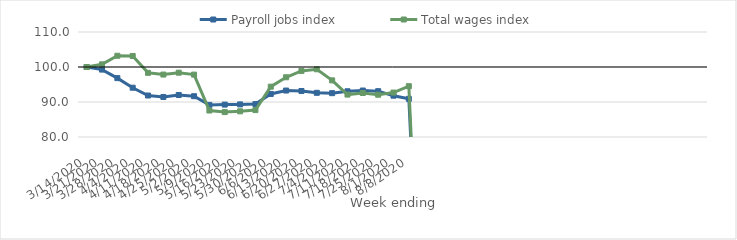
| Category | Payroll jobs index | Total wages index |
|---|---|---|
| 14/03/2020 | 100 | 100 |
| 21/03/2020 | 99.263 | 100.76 |
| 28/03/2020 | 96.819 | 103.206 |
| 04/04/2020 | 94.077 | 103.144 |
| 11/04/2020 | 91.854 | 98.338 |
| 18/04/2020 | 91.436 | 97.841 |
| 25/04/2020 | 92.001 | 98.379 |
| 02/05/2020 | 91.654 | 97.822 |
| 09/05/2020 | 89.164 | 87.568 |
| 16/05/2020 | 89.257 | 87.116 |
| 23/05/2020 | 89.315 | 87.338 |
| 30/05/2020 | 89.399 | 87.689 |
| 06/06/2020 | 92.298 | 94.38 |
| 13/06/2020 | 93.275 | 97.064 |
| 20/06/2020 | 93.146 | 98.89 |
| 27/06/2020 | 92.625 | 99.348 |
| 04/07/2020 | 92.524 | 96.181 |
| 11/07/2020 | 93.064 | 92.116 |
| 18/07/2020 | 93.28 | 92.567 |
| 25/07/2020 | 93.091 | 92.078 |
| 01/08/2020 | 91.801 | 92.695 |
| 08/08/2020 | 90.907 | 94.514 |